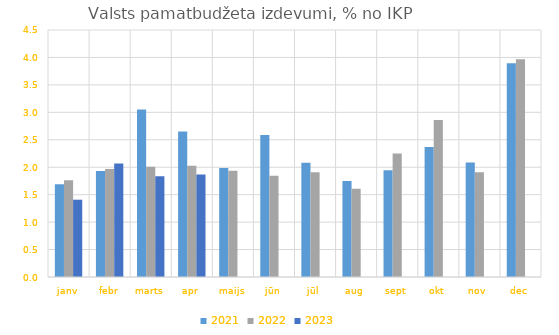
| Category | 2021 | 2022 | 2023 |
|---|---|---|---|
| janv | 1.69 | 1.764 | 1.408 |
| febr | 1.933 | 1.969 | 2.07 |
| marts | 3.051 | 2.008 | 1.837 |
| apr | 2.652 | 2.027 | 1.87 |
| maijs | 1.984 | 1.935 | 0 |
| jūn | 2.587 | 1.846 | 0 |
| jūl | 2.079 | 1.909 | 0 |
| aug | 1.748 | 1.609 | 0 |
| sept | 1.944 | 2.25 | 0 |
| okt | 2.369 | 2.86 | 0 |
| nov | 2.084 | 1.908 | 0 |
| dec | 3.895 | 3.967 | 0 |